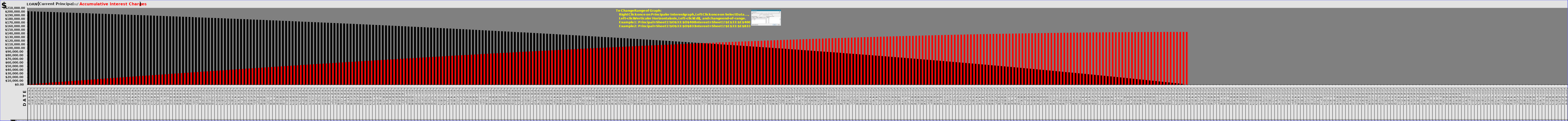
| Category | Principal | Interest |
|---|---|---|
| 43466.0 | 199711.84 | 666.67 |
| 43497.0 | 199422.72 | 1332.38 |
| 43525.0 | 199132.63 | 1997.12 |
| 43556.0 | 198841.58 | 2660.9 |
| 43586.0 | 198549.56 | 3323.71 |
| 43617.0 | 198256.56 | 3985.54 |
| 43647.0 | 197962.59 | 4646.4 |
| 43678.0 | 197667.64 | 5306.28 |
| 43709.0 | 197371.7 | 5965.17 |
| 43739.0 | 197074.78 | 6623.08 |
| 43770.0 | 196776.87 | 7280 |
| 43800.0 | 196477.96 | 7935.92 |
| 43831.0 | 196178.06 | 8590.85 |
| 43862.0 | 195877.16 | 9244.78 |
| 43891.0 | 195575.25 | 9897.7 |
| 43922.0 | 195272.34 | 10549.62 |
| 43952.0 | 194968.42 | 11200.53 |
| 43983.0 | 194663.48 | 11850.42 |
| 44013.0 | 194357.53 | 12499.3 |
| 44044.0 | 194050.56 | 13147.16 |
| 44075.0 | 193742.57 | 13794 |
| 44105.0 | 193433.55 | 14439.81 |
| 44136.0 | 193123.5 | 15084.59 |
| 44166.0 | 192812.42 | 15728.34 |
| 44197.0 | 192500.3 | 16371.05 |
| 44228.0 | 192187.14 | 17012.72 |
| 44256.0 | 191872.93 | 17653.34 |
| 44287.0 | 191557.68 | 18292.92 |
| 44317.0 | 191241.38 | 18931.45 |
| 44348.0 | 190924.02 | 19568.92 |
| 44378.0 | 190605.6 | 20205.33 |
| 44409.0 | 190286.12 | 20840.68 |
| 44440.0 | 189965.58 | 21474.97 |
| 44470.0 | 189643.97 | 22108.19 |
| 44501.0 | 189321.29 | 22740.34 |
| 44531.0 | 188997.53 | 23371.41 |
| 44562.0 | 188672.69 | 24001.4 |
| 44593.0 | 188346.77 | 24630.31 |
| 44621.0 | 188019.76 | 25258.13 |
| 44652.0 | 187691.66 | 25884.86 |
| 44682.0 | 187362.47 | 26510.5 |
| 44713.0 | 187032.18 | 27135.04 |
| 44743.0 | 186700.79 | 27758.48 |
| 44774.0 | 186368.3 | 28380.82 |
| 44805.0 | 186034.7 | 29002.05 |
| 44835.0 | 185699.99 | 29622.17 |
| 44866.0 | 185364.16 | 30241.17 |
| 44896.0 | 185027.21 | 30859.05 |
| 44927.0 | 184689.14 | 31475.81 |
| 44958.0 | 184349.94 | 32091.44 |
| 44986.0 | 184009.61 | 32705.94 |
| 45017.0 | 183668.15 | 33319.31 |
| 45047.0 | 183325.55 | 33931.54 |
| 45078.0 | 182981.81 | 34542.63 |
| 45108.0 | 182636.92 | 35152.57 |
| 45139.0 | 182290.88 | 35761.36 |
| 45170.0 | 181943.69 | 36369 |
| 45200.0 | 181595.34 | 36975.48 |
| 45231.0 | 181245.83 | 37580.8 |
| 45261.0 | 180895.15 | 38184.95 |
| 45292.0 | 180543.3 | 38787.93 |
| 45323.0 | 180190.28 | 39389.74 |
| 45352.0 | 179836.08 | 39990.37 |
| 45383.0 | 179480.7 | 40589.82 |
| 45413.0 | 179124.14 | 41188.09 |
| 45444.0 | 178766.39 | 41785.17 |
| 45474.0 | 178407.45 | 42381.06 |
| 45505.0 | 178047.31 | 42975.75 |
| 45536.0 | 177685.97 | 43569.24 |
| 45566.0 | 177323.43 | 44161.53 |
| 45597.0 | 176959.68 | 44752.61 |
| 45627.0 | 176594.72 | 45342.48 |
| 45658.0 | 176228.54 | 45931.13 |
| 45689.0 | 175861.14 | 46518.56 |
| 45717.0 | 175492.51 | 47104.76 |
| 45748.0 | 175122.66 | 47689.74 |
| 45778.0 | 174751.57 | 48273.48 |
| 45809.0 | 174379.25 | 48855.99 |
| 45839.0 | 174005.68 | 49437.25 |
| 45870.0 | 173630.87 | 50017.27 |
| 45901.0 | 173254.81 | 50596.04 |
| 45931.0 | 172877.5 | 51173.56 |
| 45962.0 | 172498.93 | 51749.82 |
| 45992.0 | 172119.1 | 52324.82 |
| 46023.0 | 171738 | 52898.55 |
| 46054.0 | 171355.63 | 53471.01 |
| 46082.0 | 170971.99 | 54042.2 |
| 46113.0 | 170587.07 | 54612.11 |
| 46143.0 | 170200.86 | 55180.73 |
| 46174.0 | 169813.37 | 55748.07 |
| 46204.0 | 169424.58 | 56314.11 |
| 46235.0 | 169034.5 | 56878.86 |
| 46266.0 | 168643.12 | 57442.31 |
| 46296.0 | 168250.43 | 58004.45 |
| 46327.0 | 167856.43 | 58565.28 |
| 46357.0 | 167461.12 | 59124.8 |
| 46388.0 | 167064.49 | 59683 |
| 46419.0 | 166666.54 | 60239.88 |
| 46447.0 | 166267.27 | 60795.44 |
| 46478.0 | 165866.66 | 61349.66 |
| 46508.0 | 165464.72 | 61902.55 |
| 46539.0 | 165061.44 | 62454.1 |
| 46569.0 | 164656.81 | 63004.3 |
| 46600.0 | 164250.84 | 63553.16 |
| 46631.0 | 163843.51 | 64100.66 |
| 46661.0 | 163434.83 | 64646.81 |
| 46692.0 | 163024.78 | 65191.59 |
| 46722.0 | 162613.37 | 65735.01 |
| 46753.0 | 162200.58 | 66277.05 |
| 46784.0 | 161786.42 | 66817.72 |
| 46813.0 | 161370.88 | 67357.01 |
| 46844.0 | 160953.95 | 67894.91 |
| 46874.0 | 160535.63 | 68431.42 |
| 46905.0 | 160115.92 | 68966.54 |
| 46935.0 | 159694.81 | 69500.26 |
| 46966.0 | 159272.3 | 70032.58 |
| 46997.0 | 158848.38 | 70563.49 |
| 47027.0 | 158423.04 | 71092.98 |
| 47058.0 | 157996.29 | 71621.06 |
| 47088.0 | 157568.11 | 72147.71 |
| 47119.0 | 157138.51 | 72672.94 |
| 47150.0 | 156707.48 | 73196.74 |
| 47178.0 | 156275.01 | 73719.1 |
| 47209.0 | 155841.1 | 74240.02 |
| 47239.0 | 155405.74 | 74759.49 |
| 47270.0 | 154968.93 | 75277.51 |
| 47300.0 | 154530.66 | 75794.07 |
| 47331.0 | 154090.93 | 76309.17 |
| 47362.0 | 153649.74 | 76822.81 |
| 47392.0 | 153207.08 | 77334.98 |
| 47423.0 | 152762.94 | 77845.67 |
| 47453.0 | 152317.32 | 78354.88 |
| 47484.0 | 151870.21 | 78862.6 |
| 47515.0 | 151421.61 | 79368.83 |
| 47543.0 | 150971.52 | 79873.57 |
| 47574.0 | 150519.93 | 80376.81 |
| 47604.0 | 150066.83 | 80878.54 |
| 47635.0 | 149612.22 | 81378.76 |
| 47665.0 | 149156.1 | 81877.47 |
| 47696.0 | 148698.46 | 82374.66 |
| 47727.0 | 148239.29 | 82870.32 |
| 47757.0 | 147778.59 | 83364.45 |
| 47788.0 | 147316.36 | 83857.05 |
| 47818.0 | 146852.58 | 84348.1 |
| 47849.0 | 146387.26 | 84837.61 |
| 47880.0 | 145920.39 | 85325.57 |
| 47908.0 | 145451.96 | 85811.97 |
| 47939.0 | 144981.97 | 86296.81 |
| 47969.0 | 144510.41 | 86780.08 |
| 48000.0 | 144037.28 | 87261.78 |
| 48030.0 | 143562.57 | 87741.9 |
| 48061.0 | 143086.28 | 88220.44 |
| 48092.0 | 142608.4 | 88697.39 |
| 48122.0 | 142128.93 | 89172.75 |
| 48153.0 | 141647.86 | 89646.51 |
| 48183.0 | 141165.19 | 90118.67 |
| 48214.0 | 140680.91 | 90589.22 |
| 48245.0 | 140195.02 | 91058.16 |
| 48274.0 | 139707.51 | 91525.48 |
| 48305.0 | 139218.37 | 91991.17 |
| 48335.0 | 138727.6 | 92455.23 |
| 48366.0 | 138235.2 | 92917.66 |
| 48396.0 | 137741.15 | 93378.44 |
| 48427.0 | 137245.46 | 93837.58 |
| 48458.0 | 136748.11 | 94295.06 |
| 48488.0 | 136249.11 | 94750.89 |
| 48519.0 | 135748.44 | 95205.05 |
| 48549.0 | 135246.1 | 95657.54 |
| 48580.0 | 134742.09 | 96108.36 |
| 48611.0 | 134236.4 | 96557.5 |
| 48639.0 | 133729.02 | 97004.95 |
| 48670.0 | 133219.95 | 97450.71 |
| 48700.0 | 132709.19 | 97894.78 |
| 48731.0 | 132196.72 | 98337.14 |
| 48761.0 | 131682.55 | 98777.8 |
| 48792.0 | 131166.66 | 99216.74 |
| 48823.0 | 130649.05 | 99653.96 |
| 48853.0 | 130129.72 | 100089.46 |
| 48884.0 | 129608.66 | 100523.23 |
| 48914.0 | 129085.86 | 100955.26 |
| 48945.0 | 128561.32 | 101385.55 |
| 48976.0 | 128035.03 | 101814.09 |
| 49004.0 | 127506.98 | 102240.87 |
| 49035.0 | 126977.17 | 102665.89 |
| 49065.0 | 126445.6 | 103089.15 |
| 49096.0 | 125912.26 | 103510.64 |
| 49126.0 | 125377.14 | 103930.35 |
| 49157.0 | 124840.23 | 104348.27 |
| 49188.0 | 124301.53 | 104764.4 |
| 49218.0 | 123761.04 | 105178.74 |
| 49249.0 | 123218.75 | 105591.28 |
| 49279.0 | 122674.65 | 106002.01 |
| 49310.0 | 122128.74 | 106410.93 |
| 49341.0 | 121581.01 | 106818.03 |
| 49369.0 | 121031.45 | 107223.3 |
| 49400.0 | 120480.06 | 107626.74 |
| 49430.0 | 119926.83 | 108028.34 |
| 49461.0 | 119371.76 | 108428.1 |
| 49491.0 | 118814.84 | 108826.01 |
| 49522.0 | 118256.06 | 109222.06 |
| 49553.0 | 117695.42 | 109616.25 |
| 49583.0 | 117132.91 | 110008.57 |
| 49614.0 | 116568.52 | 110399.01 |
| 49644.0 | 116002.25 | 110787.57 |
| 49675.0 | 115434.09 | 111174.24 |
| 49706.0 | 114864.04 | 111559.02 |
| 49735.0 | 114292.09 | 111941.9 |
| 49766.0 | 113718.23 | 112322.87 |
| 49796.0 | 113142.46 | 112701.93 |
| 49827.0 | 112564.77 | 113079.07 |
| 49857.0 | 111985.16 | 113454.29 |
| 49888.0 | 111403.61 | 113827.57 |
| 49919.0 | 110820.13 | 114198.92 |
| 49949.0 | 110234.7 | 114568.32 |
| 49980.0 | 109647.32 | 114935.77 |
| 50010.0 | 109057.98 | 115301.26 |
| 50041.0 | 108466.68 | 115664.79 |
| 50072.0 | 107873.41 | 116026.35 |
| 50100.0 | 107278.16 | 116385.93 |
| 50131.0 | 106680.92 | 116743.52 |
| 50161.0 | 106081.69 | 117099.12 |
| 50192.0 | 105480.47 | 117452.73 |
| 50222.0 | 104877.24 | 117804.33 |
| 50253.0 | 104272 | 118153.92 |
| 50284.0 | 103664.74 | 118501.49 |
| 50314.0 | 103055.46 | 118847.04 |
| 50345.0 | 102444.15 | 119190.56 |
| 50375.0 | 101830.8 | 119532.04 |
| 50406.0 | 101215.41 | 119871.48 |
| 50437.0 | 100597.96 | 120208.86 |
| 50465.0 | 99978.46 | 120544.19 |
| 50496.0 | 99356.89 | 120877.45 |
| 50526.0 | 98733.25 | 121208.64 |
| 50557.0 | 98107.53 | 121537.75 |
| 50587.0 | 97479.73 | 121864.78 |
| 50618.0 | 96849.83 | 122189.71 |
| 50649.0 | 96217.83 | 122512.54 |
| 50679.0 | 95583.73 | 122833.27 |
| 50710.0 | 94947.51 | 123151.88 |
| 50740.0 | 94309.17 | 123468.37 |
| 50771.0 | 93668.7 | 123782.73 |
| 50802.0 | 93026.1 | 124094.96 |
| 50830.0 | 92381.36 | 124405.05 |
| 50861.0 | 91734.47 | 124712.99 |
| 50891.0 | 91085.42 | 125018.77 |
| 50922.0 | 90434.21 | 125322.39 |
| 50952.0 | 89780.83 | 125623.84 |
| 50983.0 | 89125.27 | 125923.11 |
| 51014.0 | 88467.52 | 126220.19 |
| 51044.0 | 87807.58 | 126515.08 |
| 51075.0 | 87145.44 | 126807.77 |
| 51105.0 | 86481.09 | 127098.25 |
| 51136.0 | 85814.53 | 127386.52 |
| 51167.0 | 85145.75 | 127672.57 |
| 51196.0 | 84474.74 | 127956.39 |
| 51227.0 | 83801.49 | 128237.97 |
| 51257.0 | 83126 | 128517.31 |
| 51288.0 | 82448.26 | 128794.4 |
| 51318.0 | 81768.26 | 129069.23 |
| 51349.0 | 81085.99 | 129341.79 |
| 51380.0 | 80401.45 | 129612.08 |
| 51410.0 | 79714.62 | 129880.08 |
| 51441.0 | 79025.51 | 130145.8 |
| 51471.0 | 78334.1 | 130409.22 |
| 51502.0 | 77640.38 | 130670.33 |
| 51533.0 | 76944.35 | 130929.13 |
| 51561.0 | 76246 | 131185.61 |
| 51592.0 | 75545.32 | 131439.76 |
| 51622.0 | 74842.31 | 131691.58 |
| 51653.0 | 74136.95 | 131941.05 |
| 51683.0 | 73429.24 | 132188.17 |
| 51714.0 | 72719.17 | 132432.93 |
| 51745.0 | 72006.74 | 132675.33 |
| 51775.0 | 71291.93 | 132915.35 |
| 51806.0 | 70574.74 | 133152.99 |
| 51836.0 | 69855.16 | 133388.24 |
| 51867.0 | 69133.18 | 133621.09 |
| 51898.0 | 68408.79 | 133851.53 |
| 51926.0 | 67681.99 | 134079.56 |
| 51957.0 | 66952.77 | 134305.17 |
| 51987.0 | 66221.12 | 134528.35 |
| 52018.0 | 65487.03 | 134749.09 |
| 52048.0 | 64750.49 | 134967.38 |
| 52079.0 | 64011.49 | 135183.21 |
| 52110.0 | 63270.03 | 135396.58 |
| 52140.0 | 62526.1 | 135607.48 |
| 52171.0 | 61779.69 | 135815.9 |
| 52201.0 | 61030.79 | 136021.83 |
| 52232.0 | 60279.4 | 136225.27 |
| 52263.0 | 59525.5 | 136426.2 |
| 52291.0 | 58769.09 | 136624.62 |
| 52322.0 | 58010.16 | 136820.52 |
| 52352.0 | 57248.7 | 137013.89 |
| 52383.0 | 56484.7 | 137204.72 |
| 52413.0 | 55718.15 | 137393 |
| 52444.0 | 54949.05 | 137578.73 |
| 52475.0 | 54177.38 | 137761.89 |
| 52505.0 | 53403.14 | 137942.48 |
| 52536.0 | 52626.32 | 138120.49 |
| 52566.0 | 51846.91 | 138295.91 |
| 52597.0 | 51064.9 | 138468.73 |
| 52628.0 | 50280.29 | 138638.95 |
| 52657.0 | 49493.06 | 138806.55 |
| 52688.0 | 48703.21 | 138971.53 |
| 52718.0 | 47910.72 | 139133.87 |
| 52749.0 | 47115.59 | 139293.57 |
| 52779.0 | 46317.81 | 139450.62 |
| 52810.0 | 45517.37 | 139605.01 |
| 52841.0 | 44714.26 | 139756.73 |
| 52871.0 | 43908.48 | 139905.78 |
| 52902.0 | 43100.01 | 140052.14 |
| 52932.0 | 42288.85 | 140195.81 |
| 52963.0 | 41474.98 | 140336.77 |
| 52994.0 | 40658.4 | 140475.02 |
| 53022.0 | 39839.1 | 140610.55 |
| 53053.0 | 39017.07 | 140743.35 |
| 53083.0 | 38192.3 | 140873.41 |
| 53114.0 | 37364.78 | 141000.72 |
| 53144.0 | 36534.5 | 141125.27 |
| 53175.0 | 35701.45 | 141247.05 |
| 53206.0 | 34865.62 | 141366.05 |
| 53236.0 | 34027.01 | 141482.27 |
| 53267.0 | 33185.6 | 141595.69 |
| 53297.0 | 32341.39 | 141706.31 |
| 53328.0 | 31494.36 | 141814.11 |
| 53359.0 | 30644.51 | 141919.09 |
| 53387.0 | 29791.83 | 142021.24 |
| 53418.0 | 28936.31 | 142120.55 |
| 53448.0 | 28077.93 | 142217 |
| 53479.0 | 27216.69 | 142310.59 |
| 53509.0 | 26352.58 | 142401.31 |
| 53540.0 | 25485.59 | 142489.15 |
| 53571.0 | 24615.71 | 142574.1 |
| 53601.0 | 23742.93 | 142656.15 |
| 53632.0 | 22867.24 | 142735.29 |
| 53662.0 | 21988.63 | 142811.51 |
| 53693.0 | 21107.1 | 142884.81 |
| 53724.0 | 20222.63 | 142955.17 |
| 53752.0 | 19335.21 | 143022.58 |
| 53783.0 | 18444.83 | 143087.03 |
| 53813.0 | 17551.48 | 143148.51 |
| 53844.0 | 16655.15 | 143207.01 |
| 53874.0 | 15755.84 | 143262.53 |
| 53905.0 | 14853.53 | 143315.05 |
| 53936.0 | 13948.21 | 143364.56 |
| 53966.0 | 13039.87 | 143411.05 |
| 53997.0 | 12128.51 | 143454.52 |
| 54027.0 | 11214.11 | 143494.95 |
| 54058.0 | 10296.66 | 143532.33 |
| 54089.0 | 9376.15 | 143566.65 |
| 54118.0 | 8452.57 | 143597.9 |
| 54149.0 | 7525.92 | 143626.08 |
| 54179.0 | 6596.18 | 143651.17 |
| 54210.0 | 5663.34 | 143673.16 |
| 54240.0 | 4727.39 | 143692.04 |
| 54271.0 | 3788.32 | 143707.8 |
| 54302.0 | 2846.12 | 143720.43 |
| 54332.0 | 1900.78 | 143729.92 |
| 54363.0 | 952.29 | 143736.26 |
| 54393.0 | 0 | 143739.43 |
| 54424.0 | 0 | 0 |
| 54455.0 | 0 | 0 |
| 54483.0 | 0 | 0 |
| 54514.0 | 0 | 0 |
| 54544.0 | 0 | 0 |
| 54575.0 | 0 | 0 |
| 54605.0 | 0 | 0 |
| 54636.0 | 0 | 0 |
| 54667.0 | 0 | 0 |
| 54697.0 | 0 | 0 |
| 54728.0 | 0 | 0 |
| 54758.0 | 0 | 0 |
| 54789.0 | 0 | 0 |
| 54820.0 | 0 | 0 |
| 54848.0 | 0 | 0 |
| 54879.0 | 0 | 0 |
| 54909.0 | 0 | 0 |
| 54940.0 | 0 | 0 |
| 54970.0 | 0 | 0 |
| 55001.0 | 0 | 0 |
| 55032.0 | 0 | 0 |
| 55062.0 | 0 | 0 |
| 55093.0 | 0 | 0 |
| 55123.0 | 0 | 0 |
| 55154.0 | 0 | 0 |
| 55185.0 | 0 | 0 |
| 55213.0 | 0 | 0 |
| 55244.0 | 0 | 0 |
| 55274.0 | 0 | 0 |
| 55305.0 | 0 | 0 |
| 55335.0 | 0 | 0 |
| 55366.0 | 0 | 0 |
| 55397.0 | 0 | 0 |
| 55427.0 | 0 | 0 |
| 55458.0 | 0 | 0 |
| 55488.0 | 0 | 0 |
| 55519.0 | 0 | 0 |
| 55550.0 | 0 | 0 |
| 55579.0 | 0 | 0 |
| 55610.0 | 0 | 0 |
| 55640.0 | 0 | 0 |
| 55671.0 | 0 | 0 |
| 55701.0 | 0 | 0 |
| 55732.0 | 0 | 0 |
| 55763.0 | 0 | 0 |
| 55793.0 | 0 | 0 |
| 55824.0 | 0 | 0 |
| 55854.0 | 0 | 0 |
| 55885.0 | 0 | 0 |
| 55916.0 | 0 | 0 |
| 55944.0 | 0 | 0 |
| 55975.0 | 0 | 0 |
| 56005.0 | 0 | 0 |
| 56036.0 | 0 | 0 |
| 56066.0 | 0 | 0 |
| 56097.0 | 0 | 0 |
| 56128.0 | 0 | 0 |
| 56158.0 | 0 | 0 |
| 56189.0 | 0 | 0 |
| 56219.0 | 0 | 0 |
| 56250.0 | 0 | 0 |
| 56281.0 | 0 | 0 |
| 56309.0 | 0 | 0 |
| 56340.0 | 0 | 0 |
| 56370.0 | 0 | 0 |
| 56401.0 | 0 | 0 |
| 56431.0 | 0 | 0 |
| 56462.0 | 0 | 0 |
| 56493.0 | 0 | 0 |
| 56523.0 | 0 | 0 |
| 56554.0 | 0 | 0 |
| 56584.0 | 0 | 0 |
| 56615.0 | 0 | 0 |
| 56646.0 | 0 | 0 |
| 56674.0 | 0 | 0 |
| 56705.0 | 0 | 0 |
| 56735.0 | 0 | 0 |
| 56766.0 | 0 | 0 |
| 56796.0 | 0 | 0 |
| 56827.0 | 0 | 0 |
| 56858.0 | 0 | 0 |
| 56888.0 | 0 | 0 |
| 56919.0 | 0 | 0 |
| 56949.0 | 0 | 0 |
| 56980.0 | 0 | 0 |
| 57011.0 | 0 | 0 |
| 57040.0 | 0 | 0 |
| 57071.0 | 0 | 0 |
| 57101.0 | 0 | 0 |
| 57132.0 | 0 | 0 |
| 57162.0 | 0 | 0 |
| 57193.0 | 0 | 0 |
| 57224.0 | 0 | 0 |
| 57254.0 | 0 | 0 |
| 57285.0 | 0 | 0 |
| 57315.0 | 0 | 0 |
| 57346.0 | 0 | 0 |
| 57377.0 | 0 | 0 |
| 57405.0 | 0 | 0 |
| 57436.0 | 0 | 0 |
| 57466.0 | 0 | 0 |
| 57497.0 | 0 | 0 |
| 57527.0 | 0 | 0 |
| 57558.0 | 0 | 0 |
| 57589.0 | 0 | 0 |
| 57619.0 | 0 | 0 |
| 57650.0 | 0 | 0 |
| 57680.0 | 0 | 0 |
| 57711.0 | 0 | 0 |
| 57742.0 | 0 | 0 |
| 57770.0 | 0 | 0 |
| 57801.0 | 0 | 0 |
| 57831.0 | 0 | 0 |
| 57862.0 | 0 | 0 |
| 57892.0 | 0 | 0 |
| 57923.0 | 0 | 0 |
| 57954.0 | 0 | 0 |
| 57984.0 | 0 | 0 |